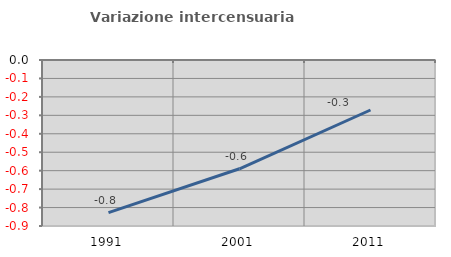
| Category | Variazione intercensuaria annua |
|---|---|
| 1991.0 | -0.827 |
| 2001.0 | -0.59 |
| 2011.0 | -0.271 |